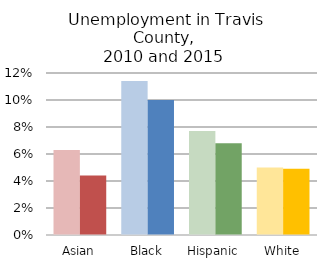
| Category | Series 0 | Series 1 |
|---|---|---|
| Asian | 0.063 | 0.044 |
| Black | 0.114 | 0.1 |
| Hispanic | 0.077 | 0.068 |
| White | 0.05 | 0.049 |